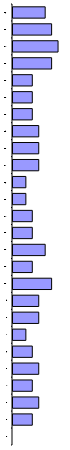
| Category | Series 0 |
|---|---|
| 0 | 0 |
| 1 | 0.103 |
| 2 | 0.138 |
| 3 | 0.103 |
| 4 | 0.138 |
| 5 | 0.103 |
| 6 | 0.069 |
| 7 | 0.138 |
| 8 | 0.138 |
| 9 | 0.207 |
| 10 | 0.103 |
| 11 | 0.172 |
| 12 | 0.103 |
| 13 | 0.103 |
| 14 | 0.069 |
| 15 | 0.069 |
| 16 | 0.138 |
| 17 | 0.138 |
| 18 | 0.138 |
| 19 | 0.103 |
| 20 | 0.103 |
| 21 | 0.103 |
| 22 | 0.207 |
| 23 | 0.241 |
| 24 | 0.207 |
| 25 | 0.172 |